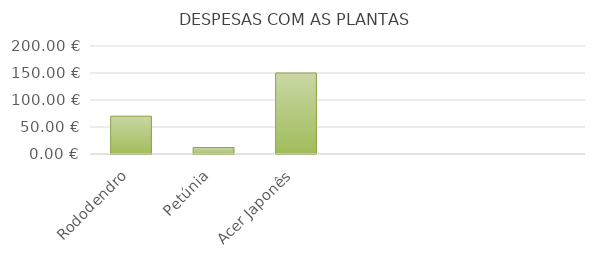
| Category | Rododendro |
|---|---|
| Rododendro | 70 |
| Petúnia | 11.94 |
| Acer Japonês | 150 |